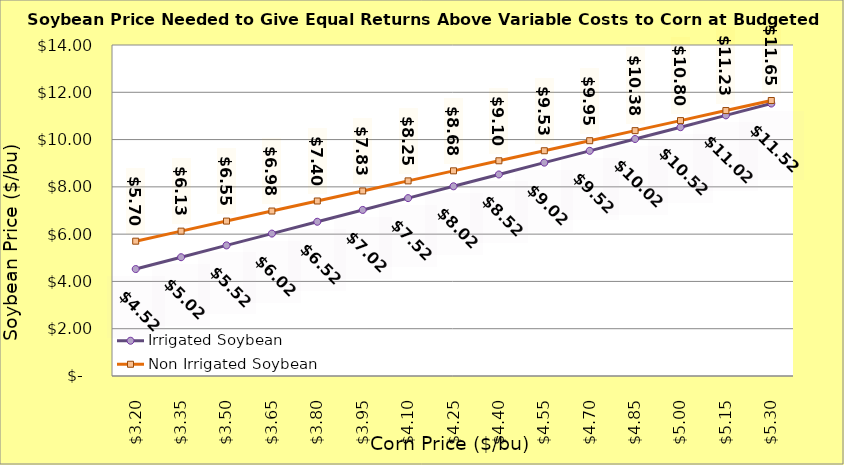
| Category | Irrigated Soybean | Non Irrigated Soybean |
|---|---|---|
| 3.2 | 4.524 | 5.702 |
| 3.35 | 5.024 | 6.127 |
| 3.5 | 5.524 | 6.552 |
| 3.65 | 6.024 | 6.977 |
| 3.8 | 6.524 | 7.402 |
| 3.9499999999999997 | 7.024 | 7.827 |
| 4.1 | 7.524 | 8.252 |
| 4.25 | 8.024 | 8.677 |
| 4.4 | 8.524 | 9.102 |
| 4.550000000000001 | 9.024 | 9.527 |
| 4.700000000000001 | 9.524 | 9.952 |
| 4.850000000000001 | 10.024 | 10.377 |
| 5.000000000000002 | 10.524 | 10.802 |
| 5.150000000000002 | 11.024 | 11.227 |
| 5.3000000000000025 | 11.524 | 11.652 |